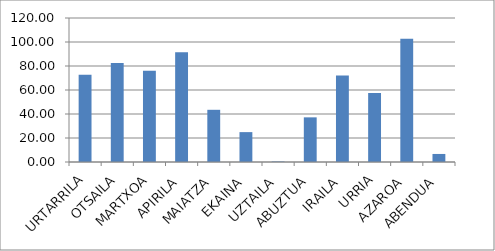
| Category | Series 0 |
|---|---|
| URTARRILA | 72.8 |
| OTSAILA | 82.5 |
| MARTXOA | 76.1 |
| APIRILA | 91.5 |
| MAIATZA | 43.5 |
| EKAINA | 24.9 |
| UZTAILA | 0.4 |
| ABUZTUA | 37.2 |
| IRAILA | 72 |
| URRIA | 57.6 |
| AZAROA | 102.8 |
| ABENDUA | 6.7 |